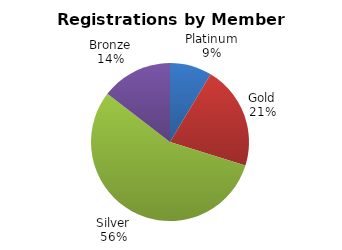
| Category | Registrations |
|---|---|
| Platinum | 13 |
| Gold | 32 |
| Silver | 84 |
| Bronze | 22 |